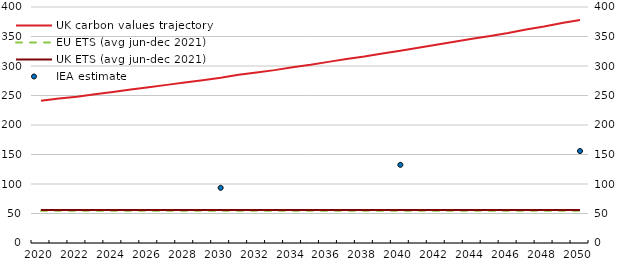
| Category | UK carbon values trajectory | EU ETS (avg jun-dec 2021) | UK ETS (avg jun-dec 2021) |
|---|---|---|---|
| 2020.0 | 241 | 54.721 | 55.967 |
| 2021.0 | 245 | 54.721 | 55.967 |
| 2022.0 | 248 | 54.721 | 55.967 |
| 2023.0 | 252 | 54.721 | 55.967 |
| 2024.0 | 256 | 54.721 | 55.967 |
| 2025.0 | 260 | 54.721 | 55.967 |
| 2026.0 | 264 | 54.721 | 55.967 |
| 2027.0 | 268 | 54.721 | 55.967 |
| 2028.0 | 272 | 54.721 | 55.967 |
| 2029.0 | 276 | 54.721 | 55.967 |
| 2030.0 | 280 | 54.721 | 55.967 |
| 2031.0 | 285 | 54.721 | 55.967 |
| 2032.0 | 289 | 54.721 | 55.967 |
| 2033.0 | 293 | 54.721 | 55.967 |
| 2034.0 | 298 | 54.721 | 55.967 |
| 2035.0 | 302 | 54.721 | 55.967 |
| 2036.0 | 307 | 54.721 | 55.967 |
| 2037.0 | 312 | 54.721 | 55.967 |
| 2038.0 | 316 | 54.721 | 55.967 |
| 2039.0 | 321 | 54.721 | 55.967 |
| 2040.0 | 326 | 54.721 | 55.967 |
| 2041.0 | 331 | 54.721 | 55.967 |
| 2042.0 | 336 | 54.721 | 55.967 |
| 2043.0 | 341 | 54.721 | 55.967 |
| 2044.0 | 346 | 54.721 | 55.967 |
| 2045.0 | 351 | 54.721 | 55.967 |
| 2046.0 | 356 | 54.721 | 55.967 |
| 2047.0 | 362 | 54.721 | 55.967 |
| 2048.0 | 367 | 54.721 | 55.967 |
| 2049.0 | 373 | 54.721 | 55.967 |
| 2050.0 | 378 | 54.721 | 55.967 |